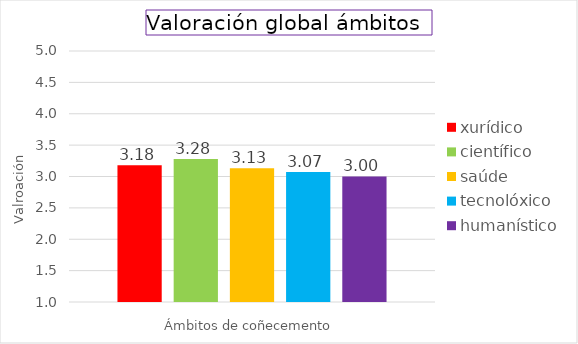
| Category | xurídico | científico | saúde | tecnolóxico | humanístico |
|---|---|---|---|---|---|
| 0 | 3.18 | 3.28 | 3.132 | 3.07 | 3.001 |